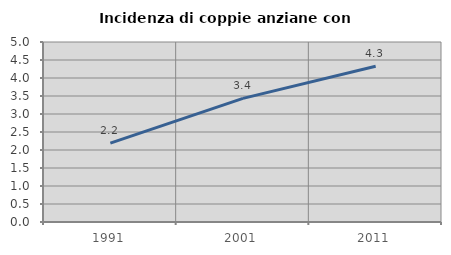
| Category | Incidenza di coppie anziane con figli |
|---|---|
| 1991.0 | 2.189 |
| 2001.0 | 3.435 |
| 2011.0 | 4.325 |